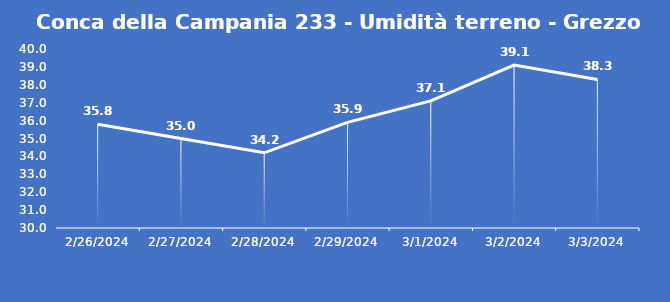
| Category | Conca della Campania 233 - Umidità terreno - Grezzo (%VWC) |
|---|---|
| 2/26/24 | 35.8 |
| 2/27/24 | 35 |
| 2/28/24 | 34.2 |
| 2/29/24 | 35.9 |
| 3/1/24 | 37.1 |
| 3/2/24 | 39.1 |
| 3/3/24 | 38.3 |